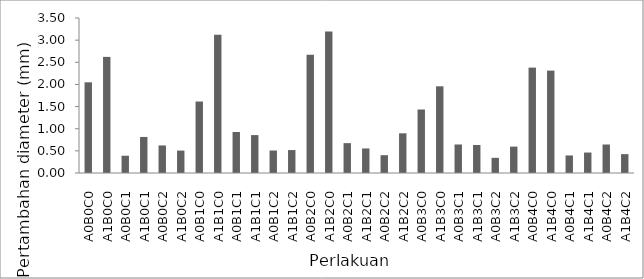
| Category | 22 |
|---|---|
| A0B0C0 | 2.048 |
| A1B0C0 | 2.622 |
| A0B0C1 | 0.39 |
| A1B0C1 | 0.814 |
| A0B0C2 | 0.622 |
| A1B0C2 | 0.506 |
| A0B1C0 | 1.614 |
| A1B1C0 | 3.122 |
| A0B1C1 | 0.926 |
| A1B1C1 | 0.856 |
| A0B1C2 | 0.508 |
| A1B1C2 | 0.518 |
| A0B2C0 | 2.67 |
| A1B2C0 | 3.194 |
| A0B2C1 | 0.674 |
| A1B2C1 | 0.554 |
| A0B2C2 | 0.402 |
| A1B2C2 | 0.896 |
| A0B3C0 | 1.434 |
| A1B3C0 | 1.958 |
| A0B3C1 | 0.644 |
| A1B3C1 | 0.632 |
| A0B3C2 | 0.342 |
| A1B3C2 | 0.596 |
| A0B4C0 | 2.38 |
| A1B4C0 | 2.312 |
| A0B4C1 | 0.396 |
| A1B4C1 | 0.462 |
| A0B4C2 | 0.643 |
| A1B4C2 | 0.426 |